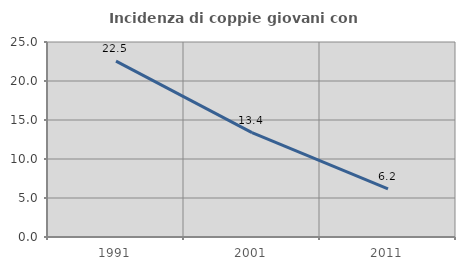
| Category | Incidenza di coppie giovani con figli |
|---|---|
| 1991.0 | 22.541 |
| 2001.0 | 13.38 |
| 2011.0 | 6.156 |